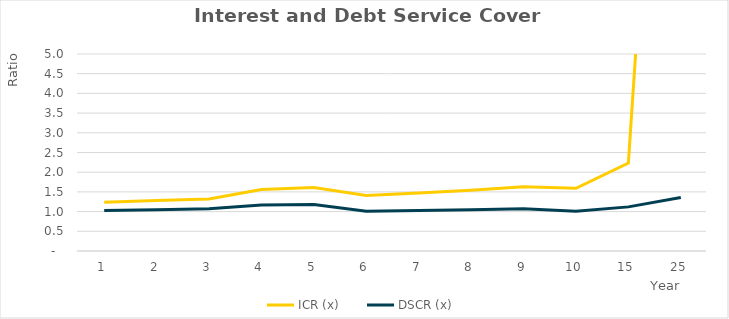
| Category | Cash Balance | Annual Cashflow |
|---|---|---|
| 1.0 | 16.473 | 16.473 |
| 2.0 | 41.174 | 24.701 |
| 3.0 | 74.228 | 33.055 |
| 4.0 | 150.823 | 76.594 |
| 5.0 | 231.89 | 81.067 |
| 6.0 | 235.006 | 3.116 |
| 7.0 | 247.214 | 12.208 |
| 8.0 | 268.696 | 21.482 |
| 9.0 | 299.638 | 30.942 |
| 10.0 | 304.375 | 4.737 |
| 15.0 | 468.636 | 52.222 |
| 25.0 | 1579.549 | 162.532 |